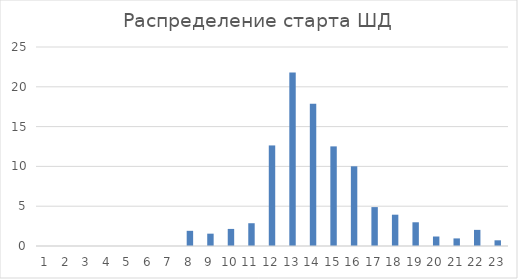
| Category | Series 0 |
|---|---|
| 0 | 0 |
| 1 | 0 |
| 2 | 0 |
| 3 | 0 |
| 4 | 0 |
| 5 | 0 |
| 6 | 0 |
| 7 | 1.907 |
| 8 | 1.549 |
| 9 | 2.145 |
| 10 | 2.861 |
| 11 | 12.634 |
| 12 | 21.812 |
| 13 | 17.878 |
| 14 | 12.515 |
| 15 | 10.012 |
| 16 | 4.887 |
| 17 | 3.933 |
| 18 | 2.98 |
| 19 | 1.192 |
| 20 | 0.954 |
| 21 | 2.026 |
| 22 | 0.715 |